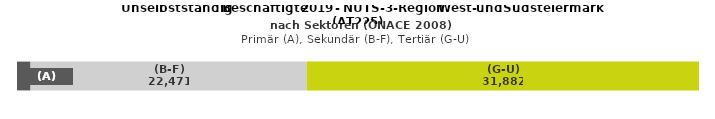
| Category | (A) | (B-F) | (G-U) |
|---|---|---|---|
| 0 | 1100 | 22471 | 31882 |